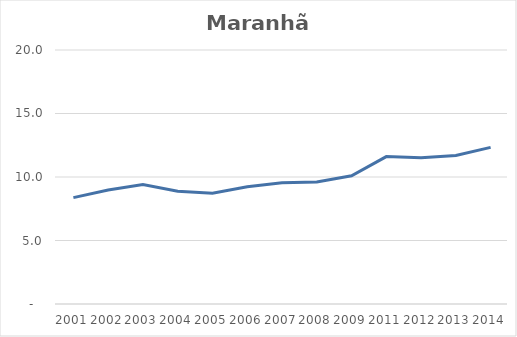
| Category | Total |
|---|---|
| 2001.0 | 8.375 |
| 2002.0 | 8.977 |
| 2003.0 | 9.413 |
| 2004.0 | 8.873 |
| 2005.0 | 8.718 |
| 2006.0 | 9.237 |
| 2007.0 | 9.553 |
| 2008.0 | 9.601 |
| 2009.0 | 10.095 |
| 2011.0 | 11.607 |
| 2012.0 | 11.509 |
| 2013.0 | 11.686 |
| 2014.0 | 12.331 |